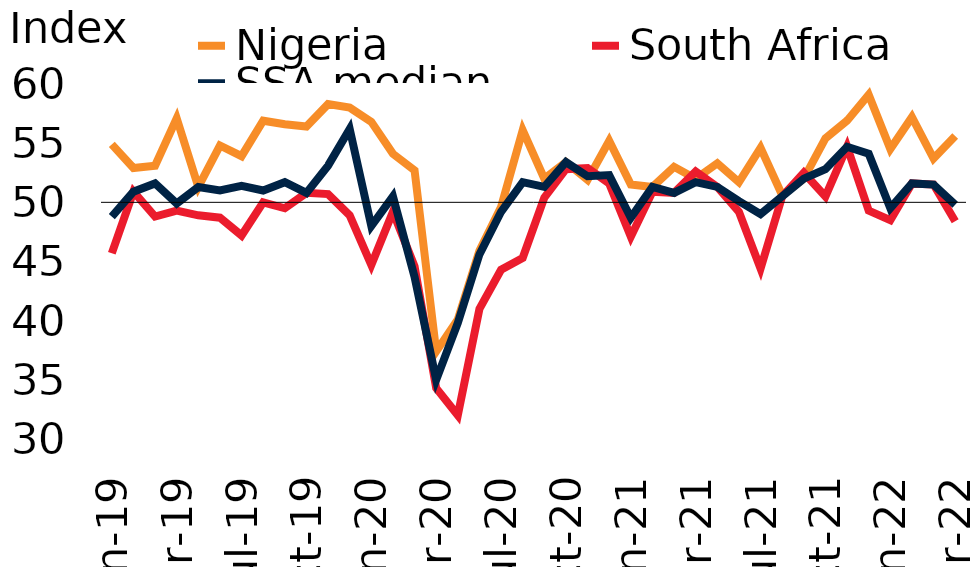
| Category | Nigeria | South Africa | SSA median |
|---|---|---|---|
| 2019-01-01 | 54.9 | 45.7 | 48.8 |
| 2019-02-01 | 52.9 | 50.9 | 50.9 |
| 2019-03-01 | 53.1 | 48.8 | 51.6 |
| 2019-04-01 | 57.1 | 49.3 | 49.9 |
| 2019-05-01 | 51.3 | 48.9 | 51.3 |
| 2019-06-01 | 54.8 | 48.7 | 51 |
| 2019-07-01 | 53.9 | 47.2 | 51.4 |
| 2019-08-01 | 56.9 | 50 | 51 |
| 2019-09-01 | 56.6 | 49.5 | 51.7 |
| 2019-10-01 | 56.4 | 50.8 | 50.8 |
| 2019-11-01 | 58.3 | 50.7 | 53.1 |
| 2019-12-01 | 58 | 48.9 | 56.2 |
| 2020-01-01 | 56.8 | 44.7 | 48 |
| 2020-02-01 | 54.1 | 49.2 | 50.5 |
| 2020-03-01 | 52.7 | 44.6 | 43.7 |
| 2020-04-01 | 37.4 | 34.3 | 35 |
| 2020-05-01 | 40.1 | 32 | 39.8 |
| 2020-06-01 | 45.9 | 41 | 45.6 |
| 2020-07-01 | 49.6 | 44.3 | 49.2 |
| 2020-08-01 | 56.1 | 45.3 | 51.7 |
| 2020-09-01 | 52 | 50.4 | 51.3 |
| 2020-10-01 | 53.4 | 52.8 | 53.4 |
| 2020-11-01 | 51.9 | 52.9 | 52.2 |
| 2020-12-01 | 55.2 | 51.6 | 52.3 |
| 2021-01-01 | 51.5 | 47.1 | 48.7 |
| 2021-02-01 | 51.3 | 50.9 | 51.3 |
| 2021-03-01 | 53 | 50.8 | 50.8 |
| 2021-04-01 | 52 | 52.6 | 51.7 |
| 2021-05-01 | 53.3 | 51.3 | 51.3 |
| 2021-06-01 | 51.7 | 49.2 | 50.1 |
| 2021-07-01 | 54.6 | 44.4 | 49 |
| 2021-08-01 | 50.6 | 50.5 | 50.5 |
| 2021-09-01 | 52 | 52.5 | 52 |
| 2021-10-01 | 55.4 | 50.5 | 52.8 |
| 2021-11-01 | 56.9 | 54.7 | 54.7 |
| 2021-12-01 | 59.1 | 49.3 | 54.1 |
| 2022-01-01 | 54.5 | 48.5 | 49.5 |
| 2022-02-01 | 57.2 | 51.6 | 51.6 |
| 2022-03-01 | 53.7 | 51.5 | 51.5 |
| 2022-04-01 | 55.6 | 48.4 | 49.8 |